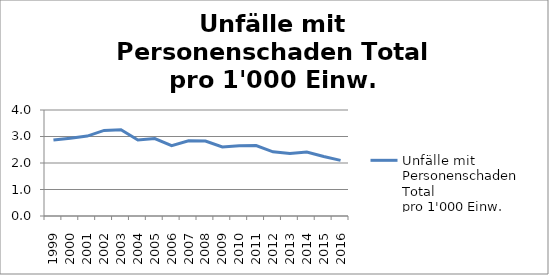
| Category | Unfälle mit Personenschaden Total
pro 1'000 Einw. |
|---|---|
| 1999.0 | 2.865 |
| 2000.0 | 2.936 |
| 2001.0 | 3.016 |
| 2002.0 | 3.23 |
| 2003.0 | 3.257 |
| 2004.0 | 2.869 |
| 2005.0 | 2.924 |
| 2006.0 | 2.657 |
| 2007.0 | 2.838 |
| 2008.0 | 2.827 |
| 2009.0 | 2.607 |
| 2010.0 | 2.655 |
| 2011.0 | 2.657 |
| 2012.0 | 2.42 |
| 2013.0 | 2.358 |
| 2014.0 | 2.412 |
| 2015.0 | 2.244 |
| 2016.0 | 2.098 |